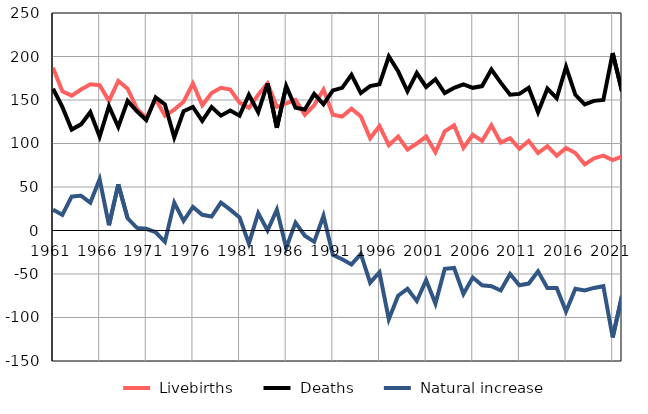
| Category |  Livebirths |  Deaths |  Natural increase |
|---|---|---|---|
| 1961.0 | 187 | 163 | 24 |
| 1962.0 | 160 | 142 | 18 |
| 1963.0 | 155 | 116 | 39 |
| 1964.0 | 162 | 122 | 40 |
| 1965.0 | 168 | 136 | 32 |
| 1966.0 | 167 | 108 | 59 |
| 1967.0 | 149 | 143 | 6 |
| 1968.0 | 172 | 119 | 53 |
| 1969.0 | 163 | 149 | 14 |
| 1970.0 | 140 | 137 | 3 |
| 1971.0 | 129 | 127 | 2 |
| 1972.0 | 151 | 153 | -2 |
| 1973.0 | 132 | 145 | -13 |
| 1974.0 | 139 | 107 | 32 |
| 1975.0 | 148 | 137 | 11 |
| 1976.0 | 169 | 142 | 27 |
| 1977.0 | 144 | 126 | 18 |
| 1978.0 | 158 | 142 | 16 |
| 1979.0 | 164 | 132 | 32 |
| 1980.0 | 162 | 138 | 24 |
| 1981.0 | 147 | 132 | 15 |
| 1982.0 | 141 | 156 | -15 |
| 1983.0 | 156 | 136 | 20 |
| 1984.0 | 169 | 169 | 0 |
| 1985.0 | 142 | 118 | 24 |
| 1986.0 | 146 | 166 | -20 |
| 1987.0 | 150 | 141 | 9 |
| 1988.0 | 133 | 139 | -6 |
| 1989.0 | 144 | 157 | -13 |
| 1990.0 | 162 | 145 | 17 |
| 1991.0 | 133 | 161 | -28 |
| 1992.0 | 131 | 164 | -33 |
| 1993.0 | 140 | 179 | -39 |
| 1994.0 | 131 | 158 | -27 |
| 1995.0 | 106 | 166 | -60 |
| 1996.0 | 120 | 168 | -48 |
| 1997.0 | 98 | 200 | -102 |
| 1998.0 | 108 | 183 | -75 |
| 1999.0 | 93 | 160 | -67 |
| 2000.0 | 100 | 181 | -81 |
| 2001.0 | 108 | 165 | -57 |
| 2002.0 | 90 | 174 | -84 |
| 2003.0 | 114 | 158 | -44 |
| 2004.0 | 121 | 164 | -43 |
| 2005.0 | 95 | 168 | -73 |
| 2006.0 | 110 | 164 | -54 |
| 2007.0 | 103 | 166 | -63 |
| 2008.0 | 121 | 185 | -64 |
| 2009.0 | 101 | 170 | -69 |
| 2010.0 | 106 | 156 | -50 |
| 2011.0 | 94 | 157 | -63 |
| 2012.0 | 103 | 164 | -61 |
| 2013.0 | 89 | 136 | -47 |
| 2014.0 | 97 | 163 | -66 |
| 2015.0 | 86 | 152 | -66 |
| 2016.0 | 95 | 188 | -93 |
| 2017.0 | 89 | 156 | -67 |
| 2018.0 | 76 | 145 | -69 |
| 2019.0 | 83 | 149 | -66 |
| 2020.0 | 86 | 150 | -64 |
| 2021.0 | 81 | 204 | -123 |
| 2022.0 | 85 | 160 | -75 |